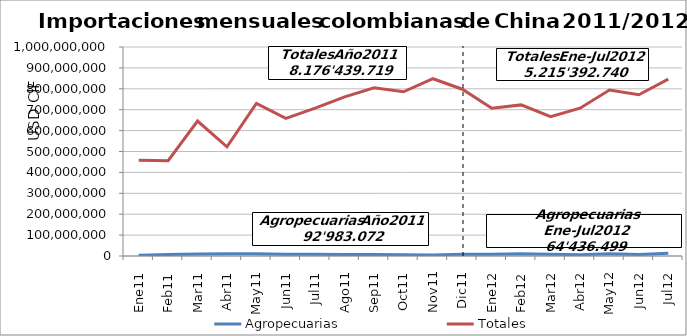
| Category | Agropecuarias | Totales |
|---|---|---|
| 0 | 3942474.7 | 458441857.09 |
| 1 | 7587038.77 | 455703848.81 |
| 2 | 9625081.8 | 645653411.78 |
| 3 | 11007880.8 | 522584033.36 |
| 4 | 10448915.97 | 729676580.68 |
| 5 | 8164468.25 | 658504857.24 |
| 6 | 8313754.98 | 707505035.84 |
| 7 | 7356675.59 | 761582518.99 |
| 8 | 7023355.03 | 805052807.9 |
| 9 | 5853768.27 | 785520625.13 |
| 10 | 4735733.09 | 848251868.9 |
| 11 | 8923924.54 | 797962272.84 |
| 12 | 8045659.66 | 706846080.96 |
| 13 | 10228463.84 | 723036064.51 |
| 14 | 8638022.83 | 666566048.93 |
| 15 | 6520530.44 | 707236830.68 |
| 16 | 11139783.68 | 794020810.3 |
| 17 | 6972105.55 | 771543689.03 |
| 18 | 12891932.76 | 846143215.39 |